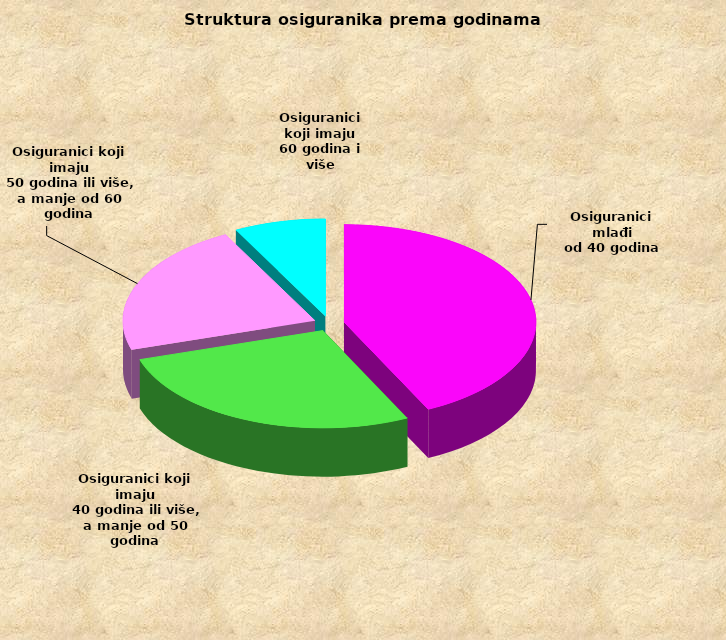
| Category | Series 0 |
|---|---|
| Osiguranici mlađi
od 40 godina | 687505 |
| Osiguranici koji imaju
 40 godina ili više, a manje od 50 godina | 440611 |
| Osiguranici koji imaju
 50 godina ili više, a manje od 60 godina | 355521 |
| Osiguranici koji imaju
60 godina i više | 124097 |